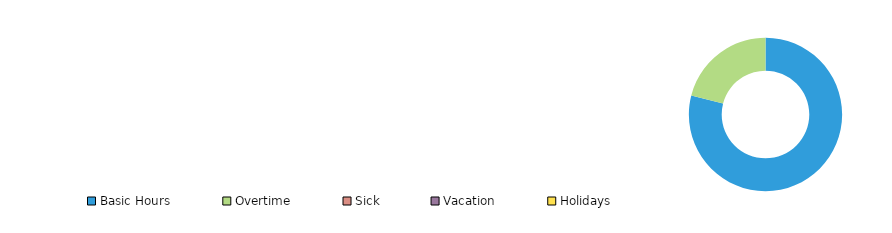
| Category | Series 0 | Series 2 | Series 3 |
|---|---|---|---|
| Basic Hours |  | 0.79 |  |
| Overtime |  | 0.21 |  |
| Sick |  | 0 |  |
| Vacation |  | 0 |  |
| Holidays |  | 0 |  |